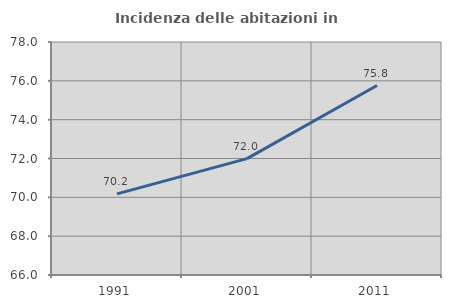
| Category | Incidenza delle abitazioni in proprietà  |
|---|---|
| 1991.0 | 70.178 |
| 2001.0 | 71.995 |
| 2011.0 | 75.758 |